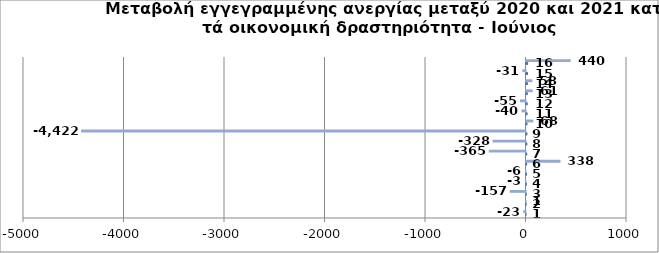
| Category | Series 0 | Series 1 |
|---|---|---|
| 0 | 1 | -23 |
| 1 | 2 | 1 |
| 2 | 3 | -157 |
| 3 | 4 | -3 |
| 4 | 5 | -6 |
| 5 | 6 | 338 |
| 6 | 7 | -365 |
| 7 | 8 | -328 |
| 8 | 9 | -4422 |
| 9 | 10 | 68 |
| 10 | 11 | -40 |
| 11 | 12 | -55 |
| 12 | 13 | 61 |
| 13 | 14 | 58 |
| 14 | 15 | -31 |
| 15 | 16 | 440 |